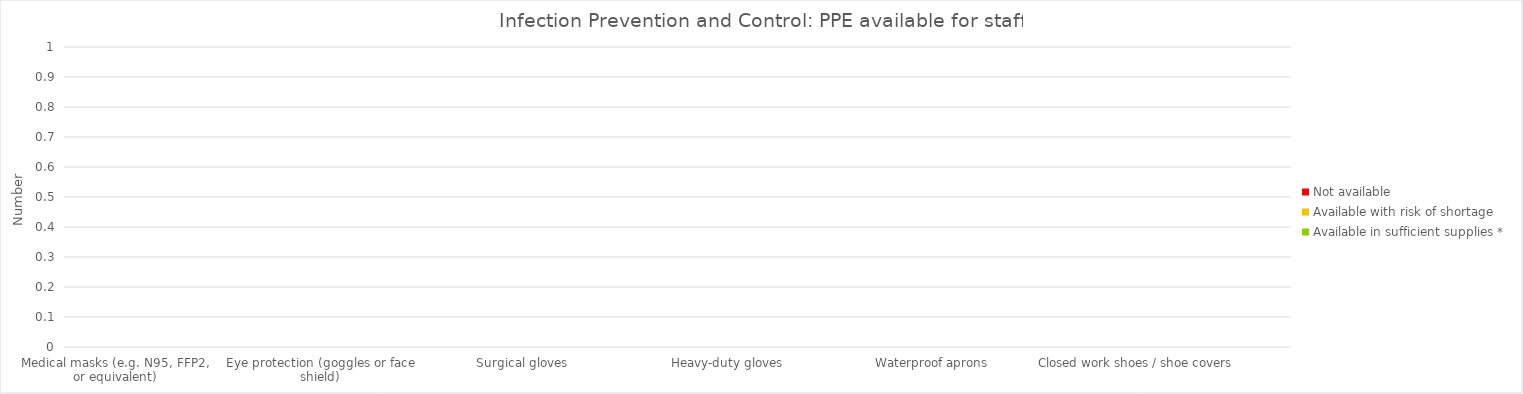
| Category | Available in sufficient supplies * | Available with risk of shortage | Not available |
|---|---|---|---|
| Medical masks (e.g. N95, FFP2, or equivalent) | 0 | 0 | 0 |
| Disposable surgical masks | 0 | 0 | 0 |
| Eye protection (goggles or face shield) | 0 | 0 | 0 |
| Examination gloves | 0 | 0 | 0 |
| Surgical gloves | 0 | 0 | 0 |
| Long-cuffed gloves | 0 | 0 | 0 |
| Heavy-duty gloves | 0 | 0 | 0 |
| Long-sleeved gown | 0 | 0 | 0 |
| Waterproof aprons | 0 | 0 | 0 |
| Surgical scrubs | 0 | 0 | 0 |
| Closed work shoes / shoe covers | 0 | 0 | 0 |
| Disposable surgical masks for patients with suspected COVID | 0 | 0 | 0 |